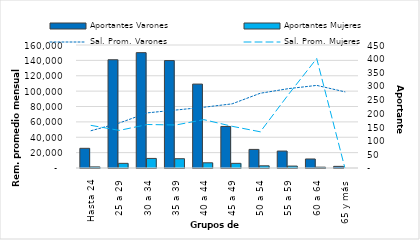
| Category | Aportantes Varones | Aportantes Mujeres |
|---|---|---|
| Hasta 24 | 72 | 4 |
| 25 a 29 | 396 | 17 |
| 30 a 34 | 422 | 35 |
| 35 a 39 | 393 | 34 |
| 40 a 44 | 307 | 19 |
| 45 a 49 | 152 | 17 |
| 50 a 54 | 68 | 8 |
| 55 a 59 | 62 | 7 |
| 60 a 64 | 33 | 3 |
| 65 y más | 6 | 0 |